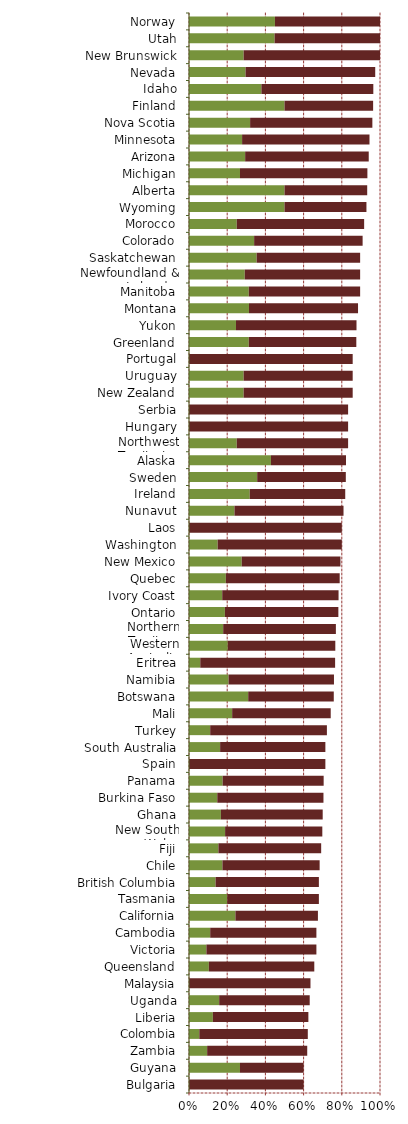
| Category |   Encourages Investment |   Not a Deterrent to Investment |
|---|---|---|
| Bulgaria | 0 | 0.6 |
| Guyana | 0.267 | 0.333 |
| Zambia | 0.095 | 0.524 |
| Colombia | 0.054 | 0.568 |
| Liberia | 0.125 | 0.5 |
| Uganda | 0.158 | 0.474 |
| Malaysia | 0 | 0.636 |
| Queensland | 0.104 | 0.552 |
| Victoria | 0.091 | 0.576 |
| Cambodia | 0.111 | 0.556 |
| California | 0.243 | 0.432 |
| Tasmania | 0.2 | 0.48 |
| British Columbia | 0.139 | 0.541 |
| Chile | 0.175 | 0.509 |
| Fiji | 0.154 | 0.538 |
| New South Wales | 0.189 | 0.509 |
| Ghana | 0.167 | 0.533 |
| Burkina Faso | 0.148 | 0.556 |
| Panama | 0.176 | 0.529 |
| Spain | 0 | 0.714 |
| South Australia | 0.163 | 0.551 |
| Turkey | 0.111 | 0.611 |
| Mali | 0.226 | 0.516 |
| Botswana | 0.31 | 0.448 |
| Namibia | 0.207 | 0.552 |
| Eritrea | 0.059 | 0.706 |
| Western Australia | 0.203 | 0.563 |
| Northern Territory | 0.179 | 0.59 |
| Ontario | 0.188 | 0.594 |
| Ivory Coast | 0.174 | 0.609 |
| Quebec | 0.193 | 0.596 |
| New Mexico | 0.276 | 0.517 |
| Washington | 0.15 | 0.65 |
| Laos | 0 | 0.8 |
| Nunavut | 0.238 | 0.571 |
| Ireland | 0.318 | 0.5 |
| Sweden | 0.357 | 0.464 |
| Alaska | 0.429 | 0.393 |
| Northwest Territories | 0.25 | 0.583 |
| Hungary | 0 | 0.833 |
| Serbia | 0 | 0.833 |
| New Zealand | 0.286 | 0.571 |
| Uruguay | 0.286 | 0.571 |
| Portugal | 0 | 0.857 |
| Greenland | 0.313 | 0.563 |
| Yukon | 0.246 | 0.631 |
| Montana | 0.314 | 0.571 |
| Manitoba | 0.313 | 0.583 |
| Newfoundland & Labrador | 0.292 | 0.604 |
| Saskatchewan | 0.354 | 0.542 |
| Colorado | 0.341 | 0.568 |
| Morocco | 0.25 | 0.667 |
| Wyoming | 0.5 | 0.429 |
| Alberta | 0.5 | 0.433 |
| Michigan | 0.267 | 0.667 |
| Arizona | 0.294 | 0.647 |
| Minnesota | 0.278 | 0.667 |
| Nova Scotia | 0.32 | 0.64 |
| Finland | 0.5 | 0.464 |
| Idaho | 0.379 | 0.586 |
| Nevada | 0.296 | 0.679 |
| New Brunswick | 0.286 | 0.714 |
| Utah | 0.448 | 0.552 |
| Norway | 0.45 | 0.55 |